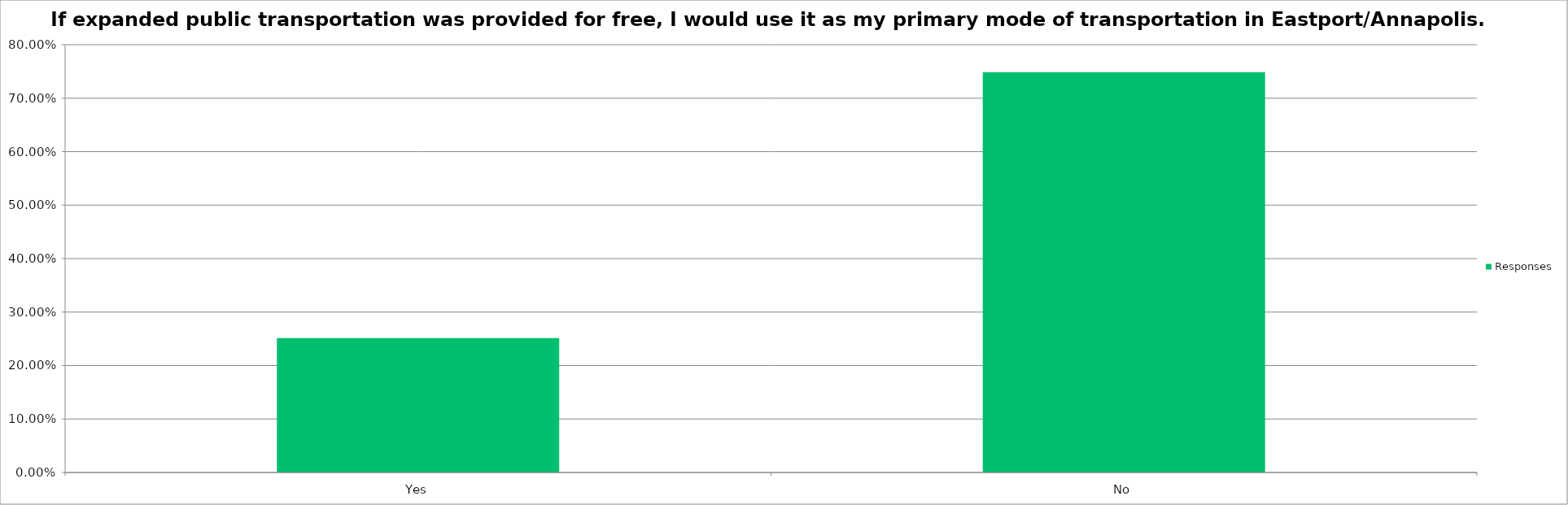
| Category | Responses |
|---|---|
| Yes | 0.251 |
| No | 0.749 |